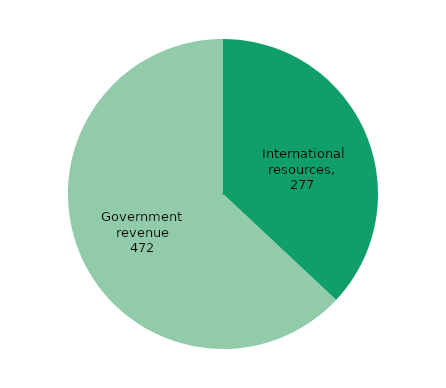
| Category | Series 0 |
|---|---|
| International resources | 277 |
| Government revenue | 472 |